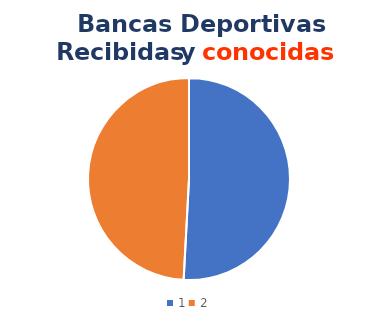
| Category | Series 0 |
|---|---|
| 0 | 90 |
| 1 | 87 |